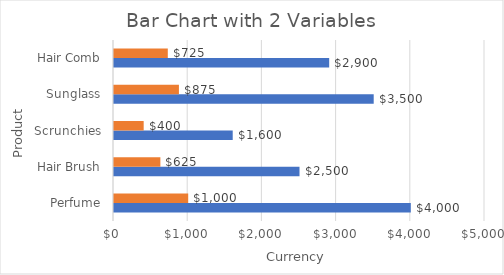
| Category | Sales | Profit  |
|---|---|---|
| Perfume | 4000 | 1000 |
| Hair Brush | 2500 | 625 |
| Scrunchies | 1600 | 400 |
| Sunglass | 3500 | 875 |
| Hair Comb | 2900 | 725 |